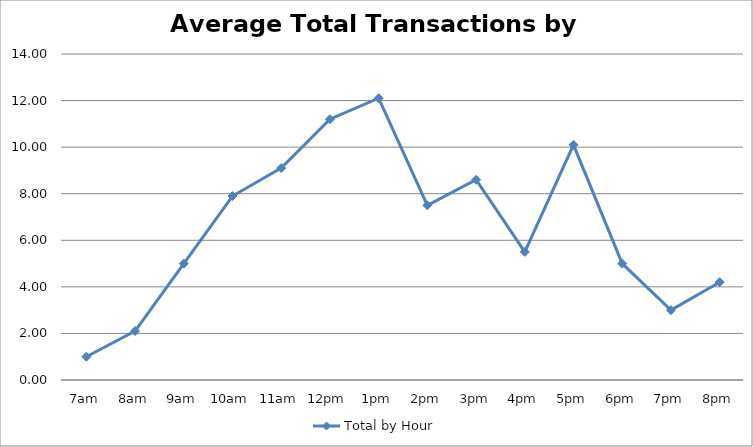
| Category | Total by Hour |
|---|---|
| 7am | 1 |
| 8am | 2.1 |
| 9am | 5 |
| 10am | 7.9 |
| 11am | 9.1 |
| 12pm | 11.2 |
| 1pm | 12.1 |
| 2pm | 7.5 |
| 3pm | 8.6 |
| 4pm | 5.5 |
| 5pm | 10.1 |
| 6pm | 5 |
| 7pm | 3 |
| 8pm | 4.2 |